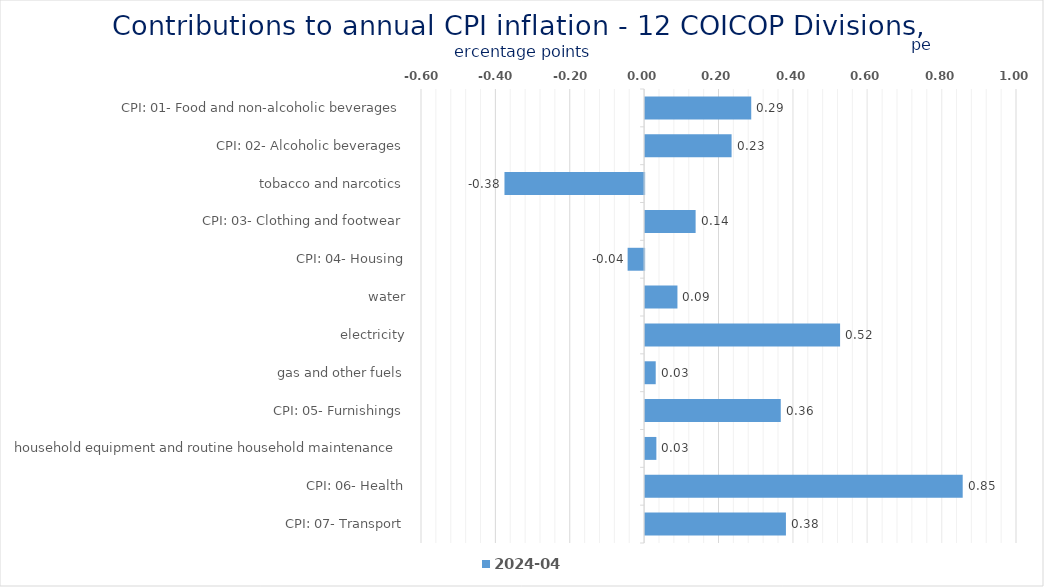
| Category | 2024-04 |
|---|---|
| CPI: 01- Food and non-alcoholic beverages | 0.285 |
| CPI: 02- Alcoholic beverages, tobacco and narcotics | 0.233 |
| CPI: 03- Clothing and footwear | -0.376 |
| CPI: 04- Housing, water, electricity, gas and other fuels | 0.136 |
| CPI: 05- Furnishings, household equipment and routine household maintenance | -0.044 |
| CPI: 06- Health | 0.087 |
| CPI: 07- Transport | 0.524 |
| CPI: 08- Communication | 0.028 |
| CPI: 09- Recreation and culture | 0.365 |
| CPI: 10- Education | 0.03 |
| CPI: 11- Restaurants and hotels | 0.854 |
| CPI: 12- Miscellaneous goods and services | 0.379 |